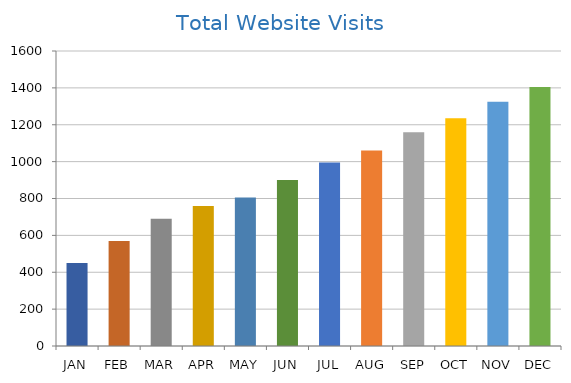
| Category | Total All Sources |
|---|---|
| JAN | 450 |
| FEB | 570 |
| MAR | 690 |
| APR | 760 |
| MAY | 805 |
| JUN | 900 |
| JUL | 995 |
| AUG | 1060 |
| SEP | 1160 |
| OCT | 1235 |
| NOV | 1325 |
| DEC | 1405 |